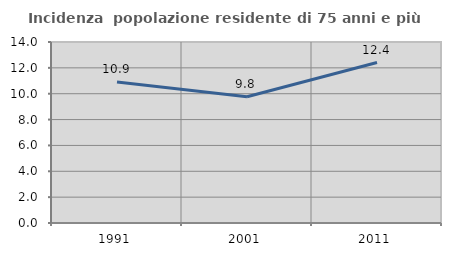
| Category | Incidenza  popolazione residente di 75 anni e più |
|---|---|
| 1991.0 | 10.909 |
| 2001.0 | 9.766 |
| 2011.0 | 12.409 |